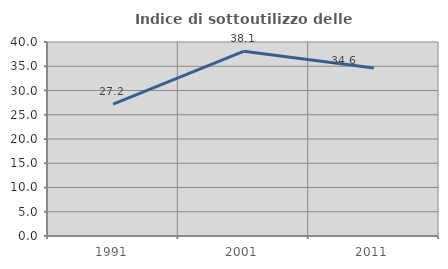
| Category | Indice di sottoutilizzo delle abitazioni  |
|---|---|
| 1991.0 | 27.187 |
| 2001.0 | 38.085 |
| 2011.0 | 34.642 |